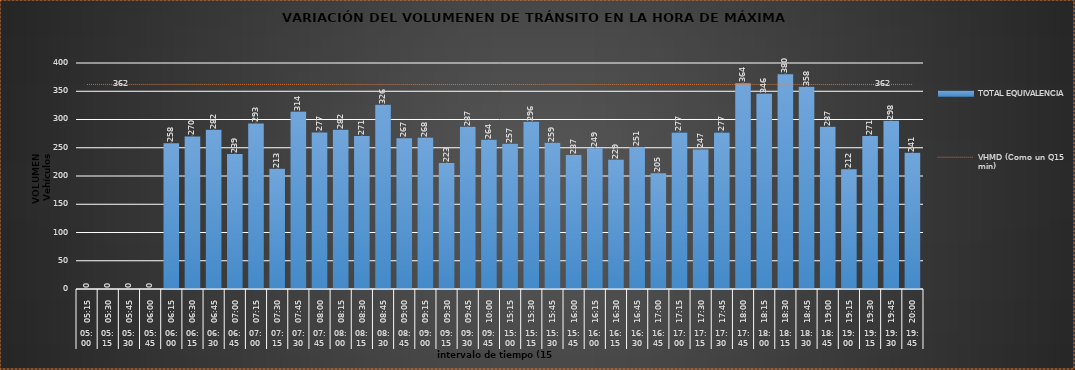
| Category | TOTAL EQUIVALENCIA   |
|---|---|
| 0 | 0 |
| 1 | 0 |
| 2 | 0 |
| 3 | 0 |
| 4 | 258 |
| 5 | 270 |
| 6 | 282 |
| 7 | 239 |
| 8 | 293 |
| 9 | 213 |
| 10 | 314 |
| 11 | 277 |
| 12 | 282 |
| 13 | 271 |
| 14 | 326 |
| 15 | 267 |
| 16 | 268 |
| 17 | 223 |
| 18 | 287 |
| 19 | 264 |
| 20 | 257 |
| 21 | 296 |
| 22 | 259 |
| 23 | 237 |
| 24 | 249 |
| 25 | 229 |
| 26 | 251 |
| 27 | 205 |
| 28 | 277 |
| 29 | 247 |
| 30 | 277 |
| 31 | 364 |
| 32 | 346 |
| 33 | 380 |
| 34 | 358 |
| 35 | 287 |
| 36 | 212 |
| 37 | 271 |
| 38 | 298 |
| 39 | 241 |